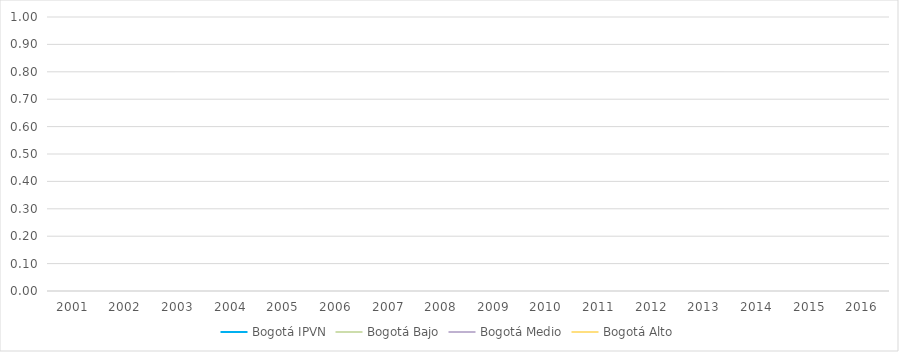
| Category | Bogotá |
|---|---|
| 2001.0 | 0 |
| 2002.0 | 0 |
| 2003.0 | 0 |
| 2004.0 | 0 |
| 2005.0 | 0 |
| 2006.0 | 0 |
| 2007.0 | 0 |
| 2008.0 | 0 |
| 2009.0 | 0 |
| 2010.0 | 0 |
| 2011.0 | 0 |
| 2012.0 | 0 |
| 2013.0 | 0 |
| 2014.0 | 0 |
| 2015.0 | 0 |
| 2016.0 | 0 |